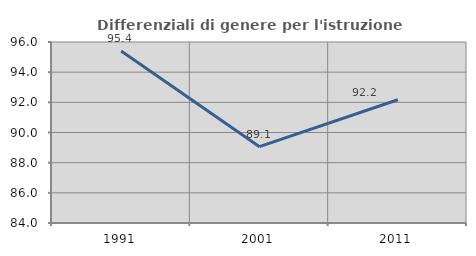
| Category | Differenziali di genere per l'istruzione superiore |
|---|---|
| 1991.0 | 95.407 |
| 2001.0 | 89.061 |
| 2011.0 | 92.174 |